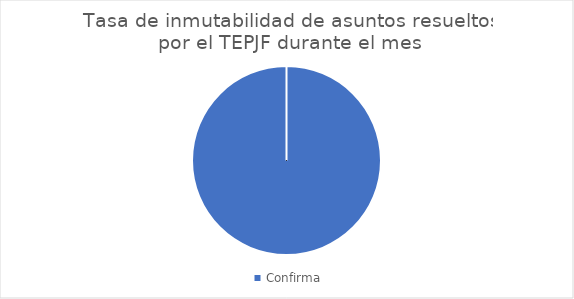
| Category | Tasa de inmutabilidad de asuntos resueltos por el TEPJF durante el mes |
|---|---|
| Confirma | 13 |